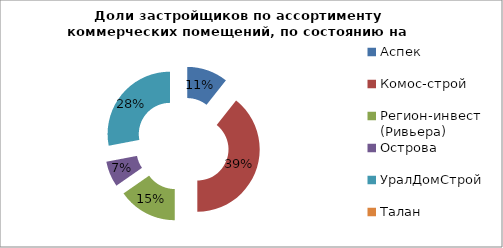
| Category | Series 0 |
|---|---|
| Аспек | 16 |
| Комос-строй | 59 |
| Регион-инвест (Ривьера) | 23 |
| Острова | 10 |
| УралДомСтрой | 42 |
| Талан | 0 |